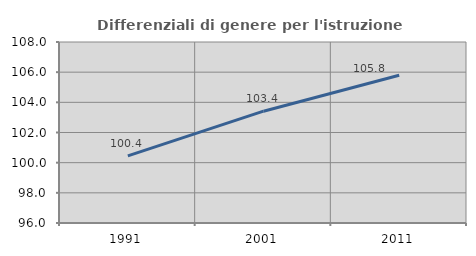
| Category | Differenziali di genere per l'istruzione superiore |
|---|---|
| 1991.0 | 100.449 |
| 2001.0 | 103.414 |
| 2011.0 | 105.799 |